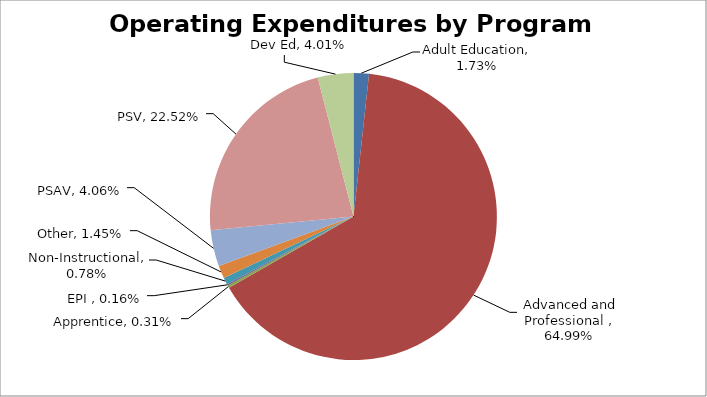
| Category | Series 0 |
|---|---|
| Adult Education | 0.017 |
| Advanced and Professional | 0.65 |
| Apprentice | 0.003 |
| EPI | 0.002 |
| Non-Instructional | 0.008 |
| Other | 0.014 |
| PSAV | 0.041 |
| PSV | 0.225 |
| Dev Ed | 0.04 |